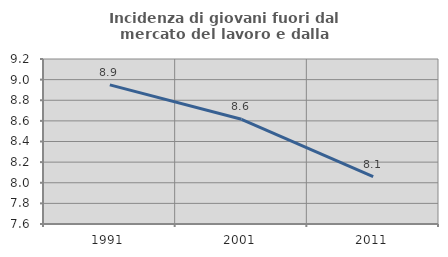
| Category | Incidenza di giovani fuori dal mercato del lavoro e dalla formazione  |
|---|---|
| 1991.0 | 8.949 |
| 2001.0 | 8.615 |
| 2011.0 | 8.059 |